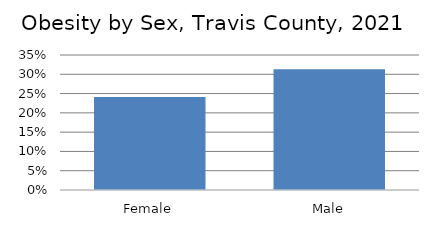
| Category | Series 0 |
|---|---|
| Female | 0.241 |
| Male | 0.313 |